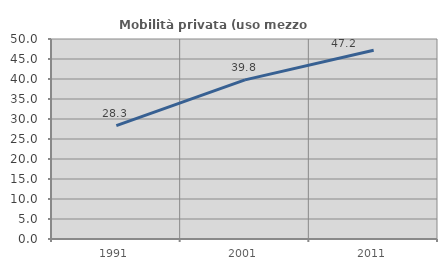
| Category | Mobilità privata (uso mezzo privato) |
|---|---|
| 1991.0 | 28.332 |
| 2001.0 | 39.78 |
| 2011.0 | 47.172 |